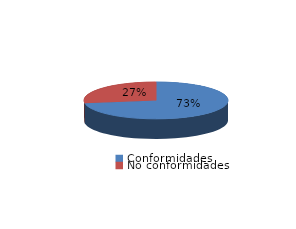
| Category | Series 0 |
|---|---|
| Conformidades | 3763 |
| No conformidades | 1425 |